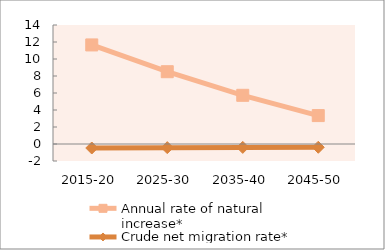
| Category | Annual rate of natural increase* | Crude net migration rate* |
|---|---|---|
| 2015-20 | 11.656 | -0.471 |
| 2025-30 | 8.504 | -0.428 |
| 2035-40 | 5.728 | -0.4 |
| 2045-50 | 3.342 | -0.384 |